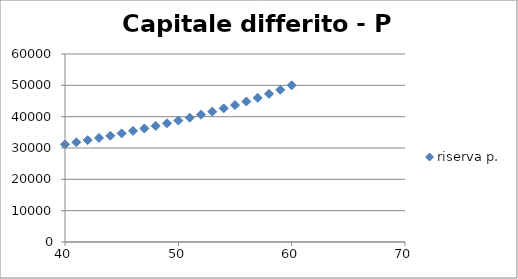
| Category | riserva p. |
|---|---|
| 40.0 | 31144.374 |
| 41.0 | 31812.149 |
| 42.0 | 32496.991 |
| 43.0 | 33200.771 |
| 44.0 | 33924.102 |
| 45.0 | 34669.777 |
| 46.0 | 35438.244 |
| 47.0 | 36229.953 |
| 48.0 | 37050.002 |
| 49.0 | 37896.812 |
| 50.0 | 38773.065 |
| 51.0 | 39681.674 |
| 52.0 | 40627.093 |
| 53.0 | 41611.108 |
| 54.0 | 42645.651 |
| 55.0 | 43719.115 |
| 56.0 | 44840.602 |
| 57.0 | 46019.262 |
| 58.0 | 47269.466 |
| 59.0 | 48589.237 |
| 60.0 | 50000 |